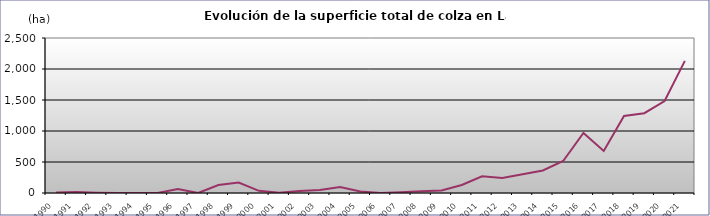
| Category | TOTAL |
|---|---|
| 1990.0 | 10 |
| 1991.0 | 15 |
| 1992.0 | 5 |
| 1993.0 | 0 |
| 1994.0 | 0 |
| 1995.0 | 0 |
| 1996.0 | 66 |
| 1997.0 | 0 |
| 1998.0 | 128 |
| 1999.0 | 169 |
| 2000.0 | 35 |
| 2001.0 | 3 |
| 2002.0 | 31 |
| 2003.0 | 47 |
| 2004.0 | 95 |
| 2005.0 | 23 |
| 2006.0 | 0 |
| 2007.0 | 14 |
| 2008.0 | 28 |
| 2009.0 | 42 |
| 2010.0 | 130 |
| 2011.0 | 269 |
| 2012.0 | 243 |
| 2013.0 | 301 |
| 2014.0 | 363 |
| 2015.0 | 516 |
| 2016.0 | 968 |
| 2017.0 | 678 |
| 2018.0 | 1243 |
| 2019.0 | 1287 |
| 2020.0 | 1484 |
| 2021.0 | 2131 |